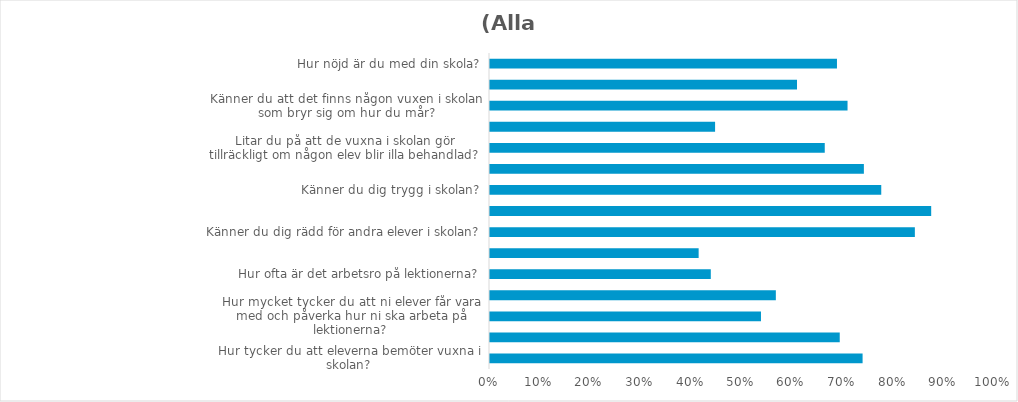
| Category | (Alla) |
|---|---|
| Hur tycker du att eleverna bemöter vuxna i skolan? | 0.738 |
| Hur tycker du att eleverna bemöter varandra i skolan? | 0.693 |
| Hur mycket tycker du att ni elever får vara med och påverka hur ni ska arbeta på lektionerna? | 0.537 |
| Hur mycket tycker du att de vuxna i skolan lyssnar på förslag från eleverna, till exempel från klassråd eller elevråd? | 0.566 |
| Hur ofta är det arbetsro på lektionerna? | 0.437 |
| Hur ofta är det så stökigt på lektionerna att du har svårt att koncentrera dig? | 0.413 |
| Känner du dig rädd för andra elever i skolan? | 0.841 |
| Känner du dig rädd för någon lärare eller annan vuxen i skolan? | 0.874 |
| Känner du dig trygg i skolan? | 0.775 |
| Känner du att du kan vara dig själv i skolan? | 0.74 |
| Litar du på att de vuxna i skolan gör tillräckligt om någon elev blir illa behandlad? | 0.663 |
| Tycker du att de vuxna i skolan har koll på vad som händer på rasterna? | 0.446 |
| Känner du att det finns någon vuxen i skolan som bryr sig om hur du mår? | 0.708 |
| Hur lätt eller svårt är det att få hjälp av elevhälsan, till exempel skolsköterskan? | 0.608 |
| Hur nöjd är du med din skola? | 0.687 |